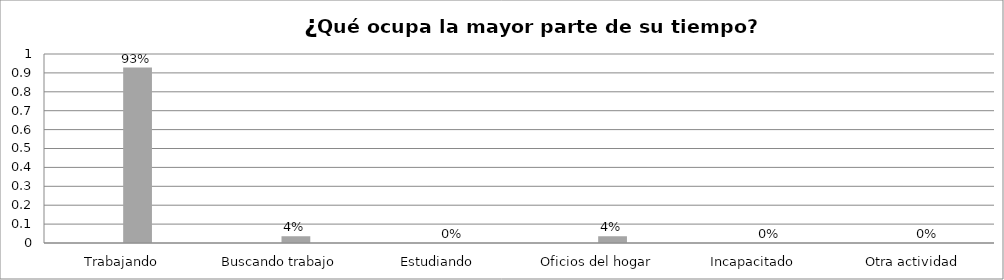
| Category | Series 0 | Series 1 | Series 2 | Series 3 |
|---|---|---|---|---|
| Trabajando |  |  | 0.929 |  |
| Buscando trabajo |  |  | 0.036 |  |
| Estudiando |  |  | 0 |  |
| Oficios del hogar |  |  | 0.036 |  |
| Incapacitado  |  |  | 0 |  |
| Otra actividad |  |  | 0 |  |